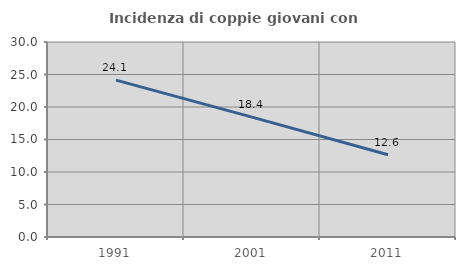
| Category | Incidenza di coppie giovani con figli |
|---|---|
| 1991.0 | 24.132 |
| 2001.0 | 18.437 |
| 2011.0 | 12.644 |